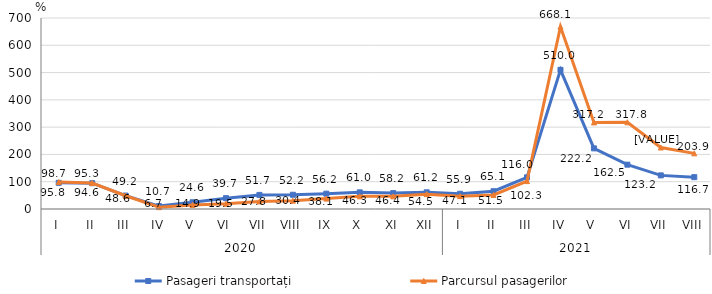
| Category | Pasageri transportați | Parcursul pasagerilor |
|---|---|---|
| 0 | 95.8 | 98.7 |
| 1 | 94.6 | 95.3 |
| 2 | 49.2 | 48.6 |
| 3 | 10.7 | 6.7 |
| 4 | 24.6 | 14.9 |
| 5 | 39.7 | 19.5 |
| 6 | 51.7 | 27.8 |
| 7 | 52.2 | 30.4 |
| 8 | 56.2 | 38.1 |
| 9 | 61 | 46.3 |
| 10 | 58.2 | 46.4 |
| 11 | 61.2 | 54.5 |
| 12 | 55.9 | 47.1 |
| 13 | 65.1 | 51.5 |
| 14 | 116 | 102.3 |
| 15 | 510 | 668.1 |
| 16 | 222.2 | 317.2 |
| 17 | 162.5 | 317.8 |
| 18 | 123.2 | 225.4 |
| 19 | 116.7 | 203.9 |